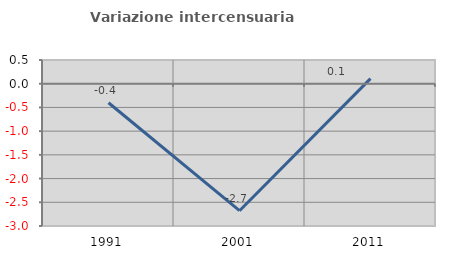
| Category | Variazione intercensuaria annua |
|---|---|
| 1991.0 | -0.401 |
| 2001.0 | -2.678 |
| 2011.0 | 0.107 |